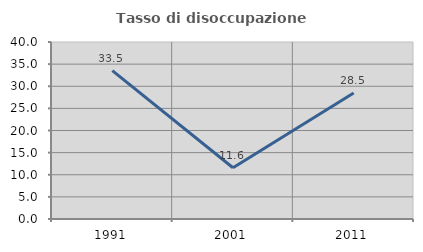
| Category | Tasso di disoccupazione giovanile  |
|---|---|
| 1991.0 | 33.531 |
| 2001.0 | 11.585 |
| 2011.0 | 28.455 |